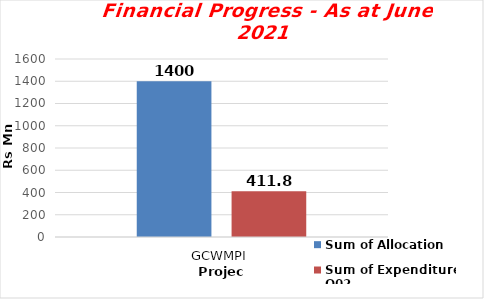
| Category | Sum of Allocation  | Sum of Expenditure Q02 |
|---|---|---|
| GCWMPI | 1400 | 411.8 |